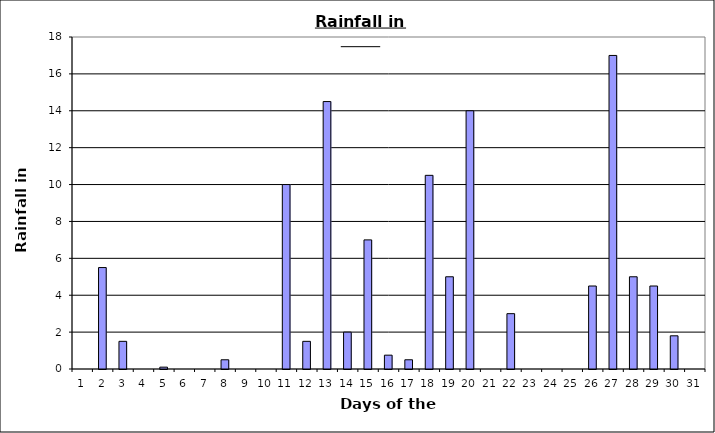
| Category | Series 0 |
|---|---|
| 0 | 0 |
| 1 | 5.5 |
| 2 | 1.5 |
| 3 | 0 |
| 4 | 0.1 |
| 5 | 0 |
| 6 | 0 |
| 7 | 0.5 |
| 8 | 0 |
| 9 | 0 |
| 10 | 10 |
| 11 | 1.5 |
| 12 | 14.5 |
| 13 | 2 |
| 14 | 7 |
| 15 | 0.75 |
| 16 | 0.5 |
| 17 | 10.5 |
| 18 | 5 |
| 19 | 14 |
| 20 | 0 |
| 21 | 3 |
| 22 | 0 |
| 23 | 0 |
| 24 | 0 |
| 25 | 4.5 |
| 26 | 17 |
| 27 | 5 |
| 28 | 4.5 |
| 29 | 1.8 |
| 30 | 0 |